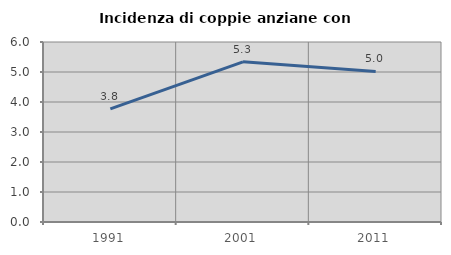
| Category | Incidenza di coppie anziane con figli |
|---|---|
| 1991.0 | 3.774 |
| 2001.0 | 5.338 |
| 2011.0 | 5.018 |